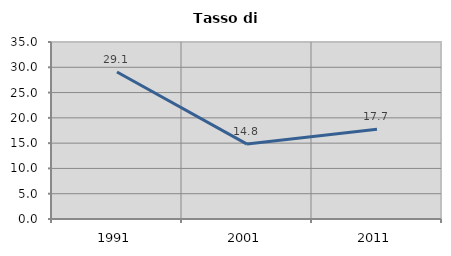
| Category | Tasso di disoccupazione   |
|---|---|
| 1991.0 | 29.065 |
| 2001.0 | 14.815 |
| 2011.0 | 17.735 |